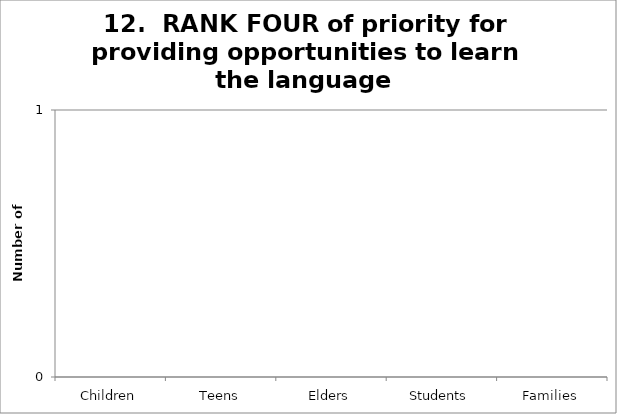
| Category | 12.  RANK FOUR of priority for providing opportunities to learn the language  |
|---|---|
| Children | 0 |
| Teens | 0 |
| Elders | 0 |
| Students | 0 |
| Families | 0 |